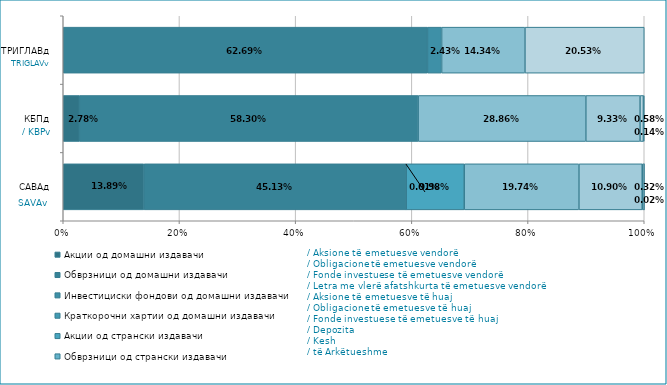
| Category | Акции од домашни издавачи  | Обврзници од домашни издавачи  | Инвестициски фондови од домашни издавачи   | Краткорочни хартии од домашни издавачи   | Акции од странски издавачи   | Обврзници од странски издавачи  | Инвестициски фондови од странски издавчи  | Депозити | Парични средства | Побарувања |
|---|---|---|---|---|---|---|---|---|---|---|
| САВАд | 0.139 | 0.451 | 0 | 0 | 0.1 | 0 | 0.197 | 0.109 | 0.003 | 0 |
| КБПд | 0.028 | 0.583 | 0 | 0 | 0 | 0 | 0.289 | 0.093 | 0.006 | 0.001 |
| ТРИГЛАВд | 0 | 0.627 | 0.024 | 0 | 0 | 0 | 0.143 | 0 | 0.205 | 0 |